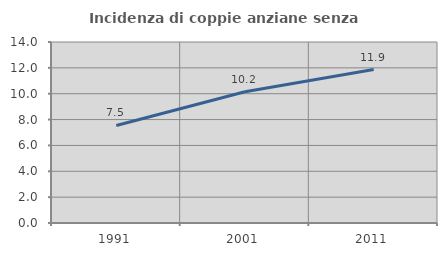
| Category | Incidenza di coppie anziane senza figli  |
|---|---|
| 1991.0 | 7.547 |
| 2001.0 | 10.154 |
| 2011.0 | 11.872 |